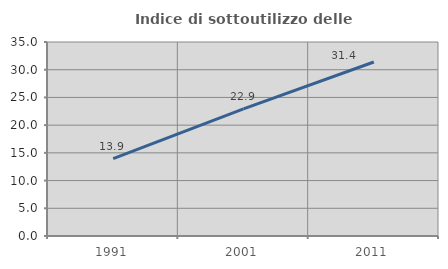
| Category | Indice di sottoutilizzo delle abitazioni  |
|---|---|
| 1991.0 | 13.944 |
| 2001.0 | 22.939 |
| 2011.0 | 31.386 |